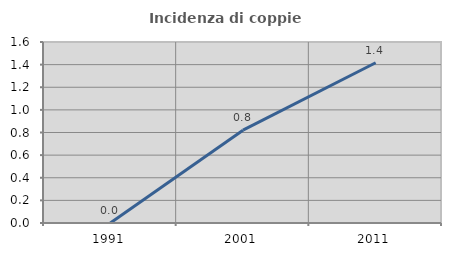
| Category | Incidenza di coppie miste |
|---|---|
| 1991.0 | 0 |
| 2001.0 | 0.82 |
| 2011.0 | 1.417 |